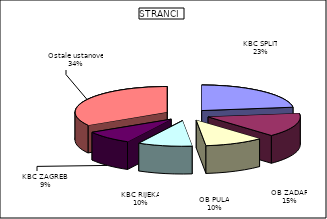
| Category | Series 0 |
|---|---|
| KBC SPLIT | 22.905 |
| OB ZADAR | 15.038 |
| OB PULA | 10.378 |
| KBC RIJEKA | 9.531 |
| KBC ZAGREB  | 8.593 |
| Ostale ustanove | 33.555 |